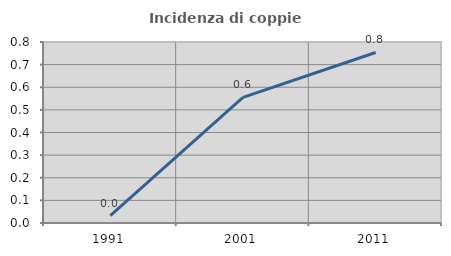
| Category | Incidenza di coppie miste |
|---|---|
| 1991.0 | 0.033 |
| 2001.0 | 0.555 |
| 2011.0 | 0.754 |